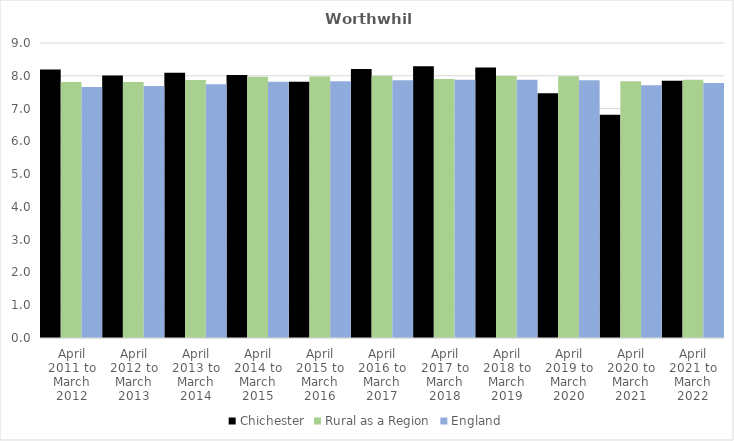
| Category | Chichester | Rural as a Region | England |
|---|---|---|---|
| April 2011 to March 2012 | 8.19 | 7.813 | 7.66 |
| April 2012 to March 2013 | 8.01 | 7.811 | 7.69 |
| April 2013 to March 2014 | 8.09 | 7.871 | 7.74 |
| April 2014 to March 2015 | 8.02 | 7.967 | 7.82 |
| April 2015 to March 2016 | 7.82 | 7.975 | 7.83 |
| April 2016 to March 2017 | 8.21 | 8.002 | 7.86 |
| April 2017 to March 2018 | 8.29 | 7.9 | 7.88 |
| April 2018 to March 2019 | 8.25 | 7.996 | 7.88 |
| April 2019 to March 2020 | 7.47 | 7.988 | 7.86 |
| April 2020 to March 2021 | 6.81 | 7.831 | 7.71 |
| April 2021 to March 2022 | 7.85 | 7.877 | 7.78 |